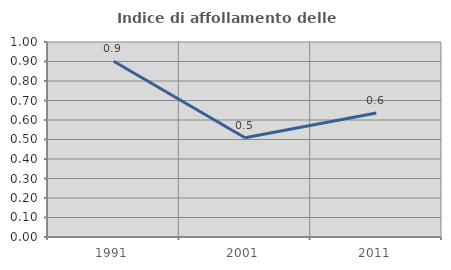
| Category | Indice di affollamento delle abitazioni  |
|---|---|
| 1991.0 | 0.901 |
| 2001.0 | 0.509 |
| 2011.0 | 0.635 |